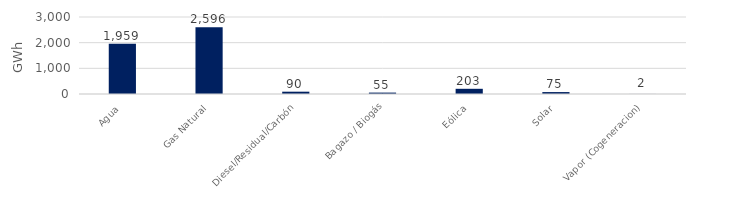
| Category | Series 0 |
|---|---|
| Agua | 1958.599 |
| Gas Natural | 2596.043 |
| Diesel/Residual/Carbón | 90.059 |
| Bagazo / Biogás | 54.58 |
| Eólica | 202.557 |
| Solar | 75.047 |
| Vapor (Cogeneracion) | 1.87 |